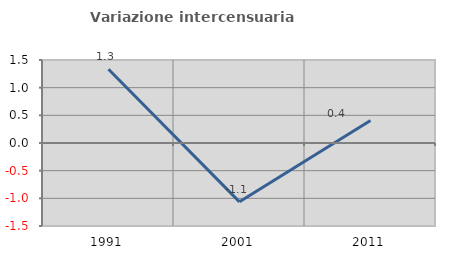
| Category | Variazione intercensuaria annua |
|---|---|
| 1991.0 | 1.332 |
| 2001.0 | -1.064 |
| 2011.0 | 0.407 |